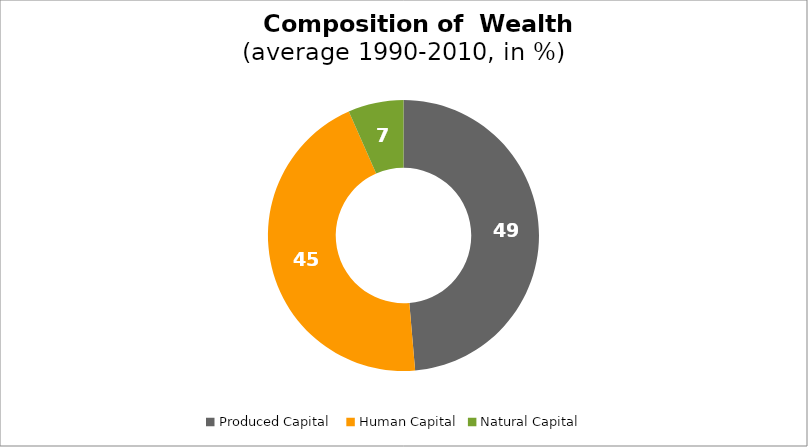
| Category | Series 0 |
|---|---|
| Produced Capital  | 48.631 |
| Human Capital | 44.759 |
| Natural Capital | 6.61 |